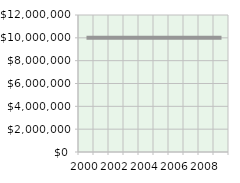
| Category | Annual Payroll
($1,000) |
|---|---|
| 2000.0 | 10000000 |
| 2001.0 | 10000000 |
| 2002.0 | 10000000 |
| 2003.0 | 10000000 |
| 2004.0 | 10000000 |
| 2005.0 | 10000000 |
| 2006.0 | 10000000 |
| 2007.0 | 10000000 |
| 2008.0 | 10000000 |
| 2009.0 | 10000000 |